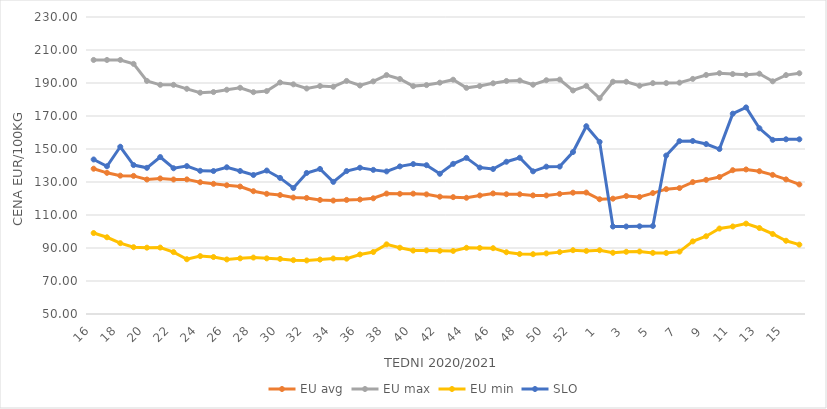
| Category | EU avg | EU max | EU min | SLO |
|---|---|---|---|---|
| 16.0 | 138.046 | 203.97 | 99.065 | 143.65 |
| 17.0 | 135.556 | 203.97 | 96.499 | 139.55 |
| 18.0 | 133.857 | 203.97 | 92.931 | 151.36 |
| 19.0 | 133.702 | 201.59 | 90.48 | 140.27 |
| 20.0 | 131.51 | 191.27 | 90.199 | 138.59 |
| 21.0 | 132.157 | 188.89 | 90.255 | 145.12 |
| 22.0 | 131.509 | 188.89 | 87.513 | 138.33 |
| 23.0 | 131.578 | 186.47 | 83.199 | 139.64 |
| 24.0 | 129.861 | 184.13 | 85.09 | 136.79 |
| 25.0 | 128.899 | 184.51 | 84.52 | 136.65 |
| 26.0 | 128.034 | 185.91 | 83.06 | 138.92 |
| 27.0 | 127.242 | 187.11 | 83.73 | 136.67 |
| 28.0 | 124.426 | 184.46 | 84.2 | 134.25 |
| 29.0 | 122.822 | 185.09 | 83.72 | 136.94 |
| 30.0 | 122.086 | 190.31 | 83.4 | 132.48 |
| 31.0 | 120.581 | 189.19 | 82.63 | 126.34 |
| 32.0 | 120.341 | 186.67 | 82.46 | 135.48 |
| 33.0 | 119.127 | 188.18 | 82.99 | 137.89 |
| 34.0 | 118.75 | 187.74 | 83.66 | 130.07 |
| 35.0 | 119.136 | 191.25 | 83.53 | 136.63 |
| 36.0 | 119.398 | 188.47 | 86.09 | 138.64 |
| 37.0 | 120.135 | 190.99 | 87.57 | 137.35 |
| 38.0 | 122.982 | 194.8 | 92.21 | 136.42 |
| 39.0 | 122.832 | 192.45 | 90.16 | 139.46 |
| 40.0 | 122.936 | 188.11 | 88.45 | 140.87 |
| 41.0 | 122.507 | 188.73 | 88.54 | 140.18 |
| 42.0 | 121.098 | 190.2 | 88.3 | 134.98 |
| 43.0 | 120.822 | 191.99 | 88.22 | 141 |
| 44.0 | 120.448 | 187.06 | 90.13 | 144.61 |
| 45.0 | 121.843 | 188.15 | 90.04 | 138.73 |
| 46.0 | 123.07 | 189.82 | 89.89 | 137.88 |
| 47.0 | 122.58 | 191.22 | 87.43 | 142.27 |
| 48.0 | 122.553 | 191.52 | 86.35 | 144.69 |
| 49.0 | 121.893 | 188.97 | 86.24 | 136.47 |
| 50.0 | 121.851 | 191.67 | 86.72 | 139.29 |
| 51.0 | 122.8 | 192.06 | 87.5 | 139.35 |
| 52.0 | 123.52 | 185.468 | 88.67 | 148.16 |
| 53.0 | 123.611 | 188.25 | 88.23 | 163.81 |
| 1.0 | 119.553 | 180.72 | 88.64 | 154.31 |
| 2.0 | 119.893 | 190.77 | 87.1 | 103.02 |
| 3.0 | 121.489 | 190.76 | 87.7 | 103.03 |
| 4.0 | 120.954 | 188.33 | 87.88 | 103.15 |
| 5.0 | 123.293 | 189.91 | 87.04 | 103.34 |
| 6.0 | 125.679 | 189.94 | 86.97 | 146.03 |
| 7.0 | 126.326 | 190.21 | 87.79 | 154.77 |
| 8.0 | 129.933 | 192.48 | 94.02 | 154.86 |
| 9.0 | 131.295 | 194.884 | 97.12 | 153 |
| 10.0 | 133.026 | 195.94 | 101.79 | 149.98 |
| 11.0 | 137.152 | 195.419 | 103.05 | 171.4 |
| 12.0 | 137.599 | 195.013 | 104.76 | 175.2 |
| 13.0 | 136.546 | 195.64 | 102.11 | 162.57 |
| 14.0 | 134.308 | 191.034 | 98.5 | 155.55 |
| 15.0 | 131.575 | 194.79 | 94.39 | 155.88 |
| 16.0 | 128.53 | 195.913 | 92.04 | 155.88 |